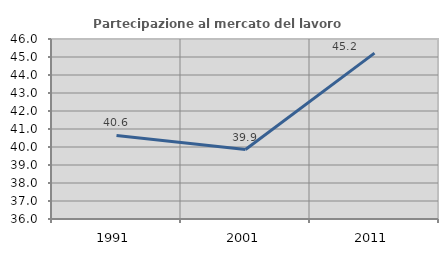
| Category | Partecipazione al mercato del lavoro  femminile |
|---|---|
| 1991.0 | 40.641 |
| 2001.0 | 39.858 |
| 2011.0 | 45.215 |